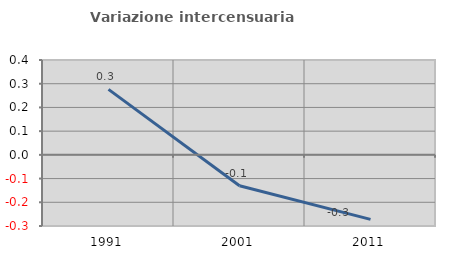
| Category | Variazione intercensuaria annua |
|---|---|
| 1991.0 | 0.276 |
| 2001.0 | -0.13 |
| 2011.0 | -0.272 |